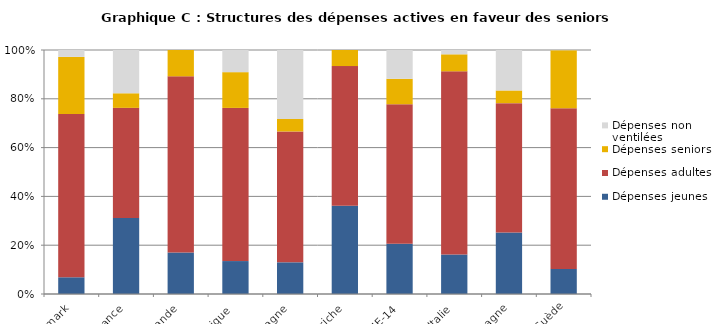
| Category | Dépenses jeunes | Dépenses adultes | Dépenses seniors | Dépenses non ventilées |
|---|---|---|---|---|
| Danemark | 275779532.03 | 2693148460.07 | 941841866.48 | 114226380.61 |
| France | 4888628319.42 | 7079779071.46 | 936429061.78 | 2782977170.01 |
| Finlande | 308037078 | 1305814278 | 195020165 | 0 |
| Belgique  | 299642073.263 | 1393539691.058 | 325330465.669 | 201660509 |
| Espagne | 640268159.98 | 2643533526.51 | 252841040.26 | 1393348740.25 |
| Autriche | 744236962.7 | 1179853137.73 | 135536750.93 | 10122.14 |
| UE-14 | 12089938793.013 | 33635990118.288 | 6124920767.479 | 6940785762.86 |
| Italie | 1574591233.55 | 7277712767.45 | 675311025.02 | 171490578.76 |
| Allemagne | 2082462859.32 | 4383372647.31 | 430397833.84 | 1370010386.03 |
| Suède | 428277272.61 | 2746677452.86 | 990366739.25 | 3906217.41 |